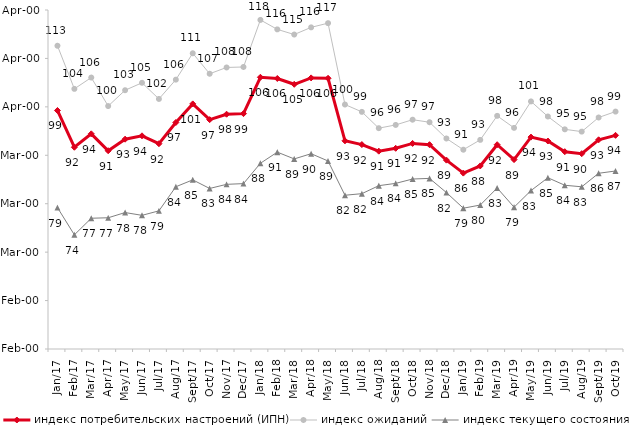
| Category | индекс потребительских настроений (ИПН) | Series 0 | индекс ожиданий | Series 3 | индекс текущего состояния |
|---|---|---|---|---|---|
| 2017-01-01 | 99.25 | 2017-01-01 | 112.617 | 2017-01-01 | 79.2 |
| 2017-02-01 | 91.66 | 2017-02-01 | 103.717 | 2017-02-01 | 73.575 |
| 2017-03-01 | 94.43 | 2017-03-01 | 106.05 | 2017-03-01 | 77 |
| 2017-04-01 | 90.94 | 2017-04-01 | 100.167 | 2017-04-01 | 77.1 |
| 2017-05-01 | 93.33 | 2017-05-01 | 103.433 | 2017-05-01 | 78.175 |
| 2017-06-01 | 94.02 | 2017-06-01 | 104.967 | 2017-06-01 | 77.6 |
| 2017-07-01 | 92.39 | 2017-07-01 | 101.633 | 2017-07-01 | 78.525 |
| 2017-08-01 | 96.77 | 2017-08-01 | 105.617 | 2017-08-01 | 83.5 |
| 2017-09-01 | 100.61 | 2017-09-01 | 111.067 | 2017-09-01 | 84.925 |
| 2017-10-01 | 97.36 | 2017-10-01 | 106.833 | 2017-10-01 | 83.15 |
| 2017-11-01 | 98.48 | 2017-11-01 | 108.133 | 2017-11-01 | 84 |
| 2017-12-01 | 98.6 | 2017-12-01 | 108.233 | 2017-12-01 | 84.15 |
| 2018-01-01 | 106.11 | 2018-01-01 | 117.95 | 2018-01-01 | 88.35 |
| 2018-02-01 | 105.86 | 2018-02-01 | 116 | 2018-02-01 | 90.65 |
| 2018-03-01 | 104.66 | 2018-03-01 | 114.933 | 2018-03-01 | 89.25 |
| 2018-04-01 | 105.98 | 2018-04-01 | 116.417 | 2018-04-01 | 90.325 |
| 2018-05-01 | 105.9 | 2018-05-01 | 117.283 | 2018-05-01 | 88.825 |
| 2018-06-01 | 92.99 | 2018-06-01 | 100.483 | 2018-06-01 | 81.75 |
| 2018-07-01 | 92.21 | 2018-07-01 | 98.967 | 2018-07-01 | 82.075 |
| 2018-08-01 | 90.85 | 2018-08-01 | 95.6 | 2018-08-01 | 83.725 |
| 2018-09-01 | 91.44 | 2018-09-01 | 96.267 | 2018-09-01 | 84.2 |
| 2018-10-01 | 92.45 | 2018-10-01 | 97.35 | 2018-10-01 | 85.1 |
| 2018-11-01 | 92.186 | 2018-11-01 | 96.823 | 2018-11-01 | 85.23 |
| 2018-12-01 | 89 | 2018-12-01 | 93.467 | 2018-12-01 | 82.3 |
| 2019-01-01 | 86.32 | 2019-01-01 | 91.15 | 2019-01-01 | 79.075 |
| 2019-02-01 | 87.8 | 2019-02-01 | 93.183 | 2019-02-01 | 79.725 |
| 2019-03-01 | 92.183 | 2019-03-01 | 98.144 | 2019-03-01 | 83.242 |
| 2019-04-01 | 89.109 | 2019-04-01 | 95.66 | 2019-04-01 | 79.282 |
| 2019-05-01 | 93.759 | 2019-05-01 | 101.123 | 2019-05-01 | 82.714 |
| 2019-06-01 | 92.948 | 2019-06-01 | 98.005 | 2019-06-01 | 85.362 |
| 2019-07-01 | 90.743 | 2019-07-01 | 95.363 | 2019-07-01 | 83.812 |
| 2019-08-01 | 90.33 | 2019-08-01 | 94.888 | 2019-08-01 | 83.492 |
| 2019-09-01 | 93.198 | 2019-09-01 | 97.805 | 2019-09-01 | 86.287 |
| 2019-10-01 | 94.119 | 2019-10-01 | 99.026 | 2019-10-01 | 86.757 |